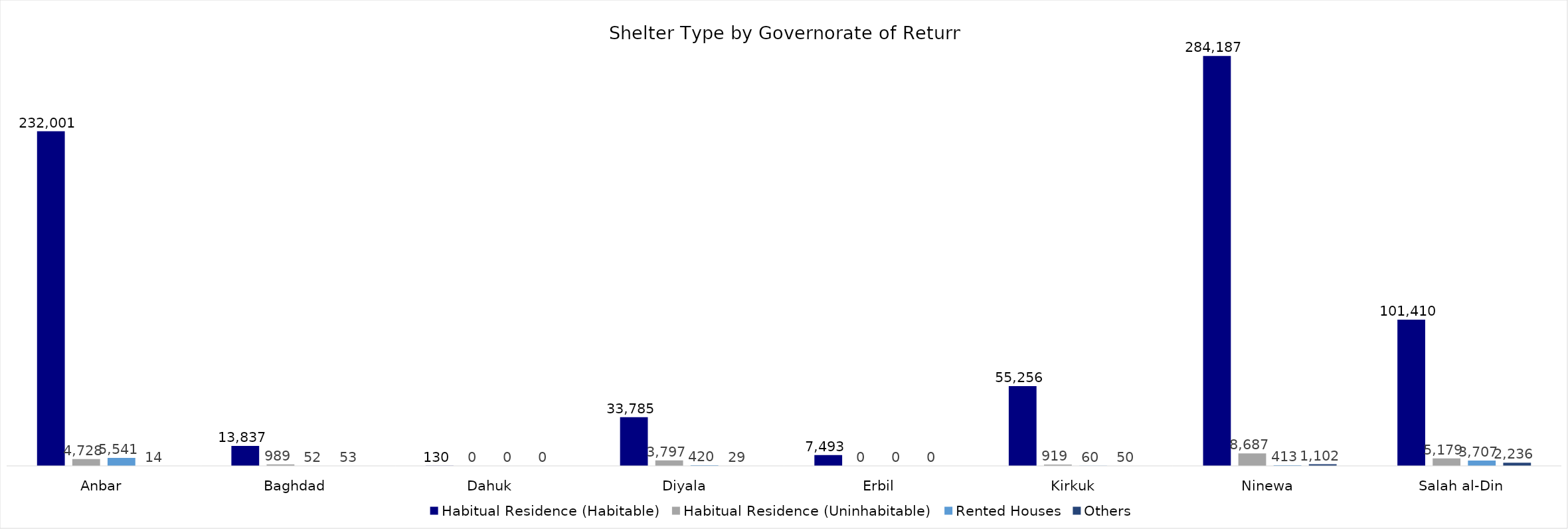
| Category | Habitual Residence (Habitable) | Habitual Residence (Uninhabitable) | Rented Houses | Others |
|---|---|---|---|---|
| Anbar | 232001 | 4728 | 5541 | 14 |
| Baghdad | 13837 | 989 | 52 | 53 |
| Dahuk | 130 | 0 | 0 | 0 |
| Diyala | 33785 | 3797 | 420 | 29 |
| Erbil | 7493 | 0 | 0 | 0 |
| Kirkuk | 55256 | 919 | 60 | 50 |
| Ninewa | 284187 | 8687 | 413 | 1102 |
| Salah al-Din | 101410 | 5179 | 3707 | 2236 |